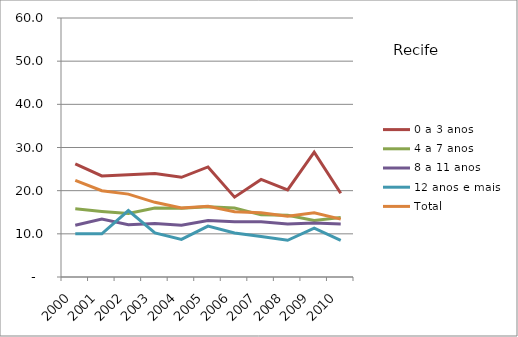
| Category | 0 a 3 anos | 4 a 7 anos | 8 a 11 anos | 12 anos e mais | Total |
|---|---|---|---|---|---|
| 2000.0 | 26.2 | 15.8 | 12 | 10 | 22.4 |
| 2001.0 | 23.4 | 15.2 | 13.4 | 10 | 20 |
| 2002.0 | 23.7 | 14.7 | 12.1 | 15.4 | 19.2 |
| 2003.0 | 24 | 16 | 12.4 | 10.2 | 17.3 |
| 2004.0 | 23.1 | 15.9 | 12 | 8.7 | 16 |
| 2005.0 | 25.5 | 16.3 | 13.1 | 11.8 | 16.4 |
| 2006.0 | 18.5 | 16 | 12.8 | 10.2 | 15.1 |
| 2007.0 | 22.6 | 14.4 | 12.8 | 9.4 | 14.9 |
| 2008.0 | 20.2 | 14.3 | 12.3 | 8.5 | 14.1 |
| 2009.0 | 28.9 | 13.1 | 12.5 | 11.3 | 14.9 |
| 2010.0 | 19.4 | 13.8 | 12.3 | 8.5 | 13.4 |